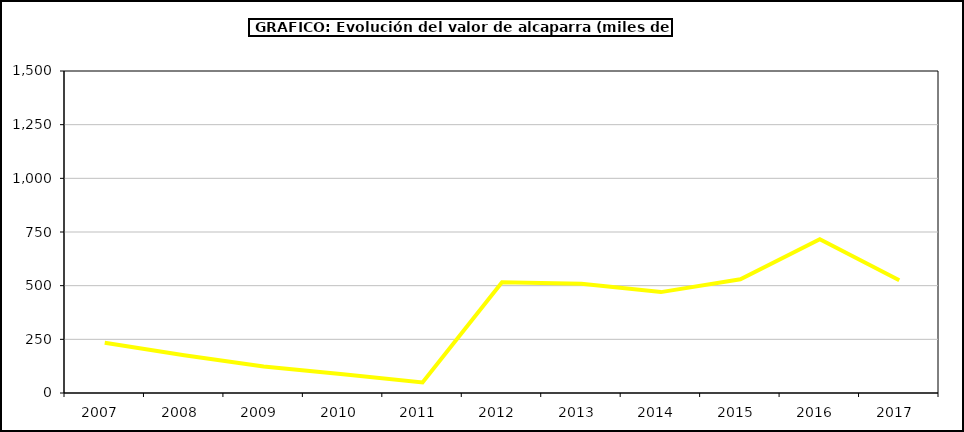
| Category | producción |
|---|---|
| 2007.0 | 233.651 |
| 2008.0 | 175.54 |
| 2009.0 | 123.08 |
| 2010.0 | 87.75 |
| 2011.0 | 49.5 |
| 2012.0 | 516 |
| 2013.0 | 508.5 |
| 2014.0 | 470 |
| 2015.0 | 530 |
| 2016.0 | 716 |
| 2017.0 | 525.442 |